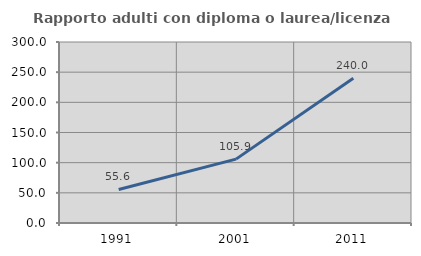
| Category | Rapporto adulti con diploma o laurea/licenza media  |
|---|---|
| 1991.0 | 55.556 |
| 2001.0 | 105.882 |
| 2011.0 | 240 |